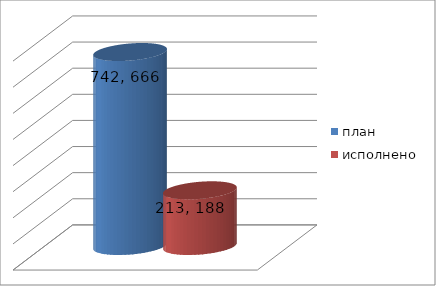
| Category | план | исполнено |
|---|---|---|
| 0 | 742666122.85 | 213188398.59 |